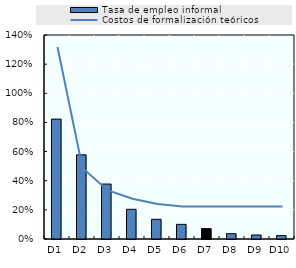
| Category | Tasa de empleo informal |
|---|---|
| D1 | 0.823 |
| D2 | 0.578 |
| D3 | 0.377 |
| D4 | 0.204 |
| D5 | 0.135 |
| D6 | 0.101 |
| D7 | 0.071 |
| D8 | 0.037 |
| D9 | 0.028 |
| D10 | 0.023 |